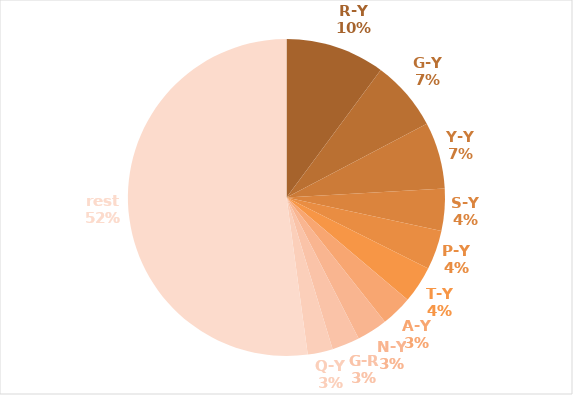
| Category | Series 0 |
|---|---|
| R-Y | 0.101 |
| G-Y | 0.072 |
| Y-Y | 0.068 |
| S-Y | 0.043 |
| P-Y | 0.04 |
| T-Y | 0.038 |
| A-Y | 0.032 |
| N-Y | 0.031 |
| G-R | 0.028 |
| Q-Y | 0.026 |
| rest | 0.521 |